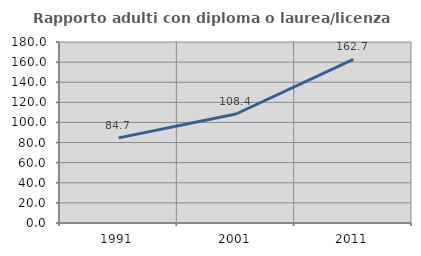
| Category | Rapporto adulti con diploma o laurea/licenza media  |
|---|---|
| 1991.0 | 84.651 |
| 2001.0 | 108.394 |
| 2011.0 | 162.673 |